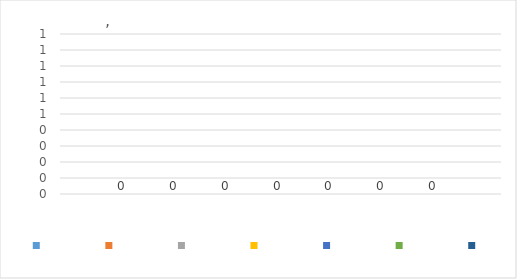
| Category | Series 0 | Series 1 | Series 2 | Series 3 | Series 4 | Series 5 | Series 6 |
|---|---|---|---|---|---|---|---|
| 0 | 0 | 0 | 0 | 0 | 0 | 0 | 0 |